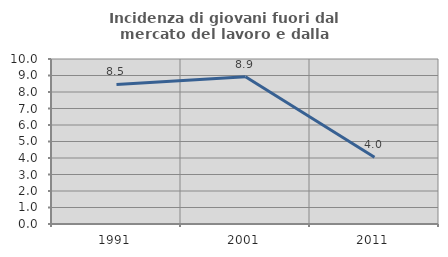
| Category | Incidenza di giovani fuori dal mercato del lavoro e dalla formazione  |
|---|---|
| 1991.0 | 8.462 |
| 2001.0 | 8.929 |
| 2011.0 | 4.04 |